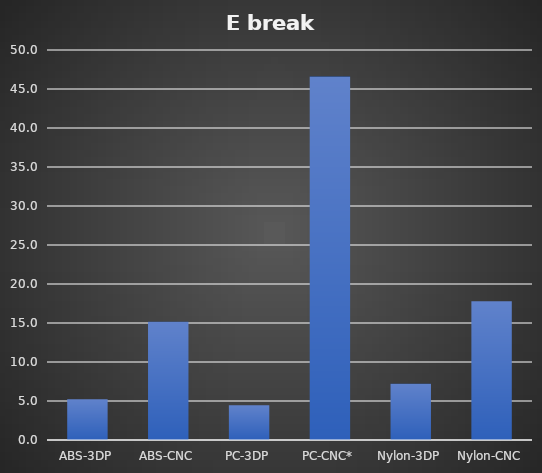
| Category | kJ/m² |
|---|---|
| ABS-3DP | 5.212 |
| ABS-CNC | 15.175 |
| PC-3DP | 4.445 |
| PC-CNC* | 46.598 |
| Nylon-3DP | 7.204 |
| Nylon-CNC | 17.781 |